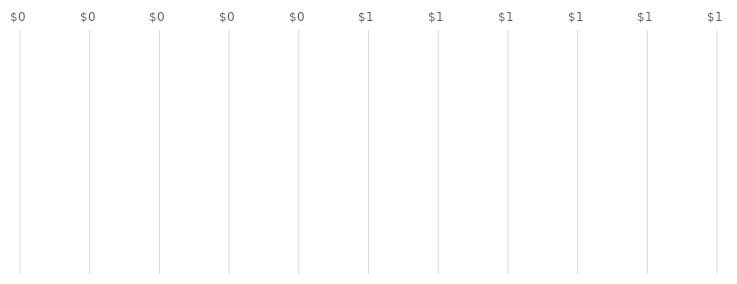
| Category | Series 0 |
|---|---|
| TOTAL ASSETS | 0 |
| TOTAL LIABILITIES AND OWNER'S EQUITY | 0 |